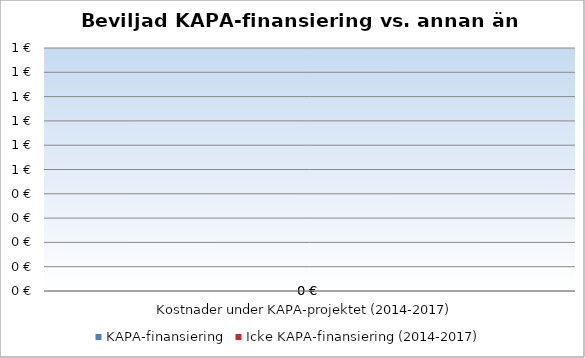
| Category | KAPA-finansiering | Icke KAPA-finansiering (2014-2017) |
|---|---|---|
| Kostnader under KAPA-projektet (2014-2017) | 0 | 0 |